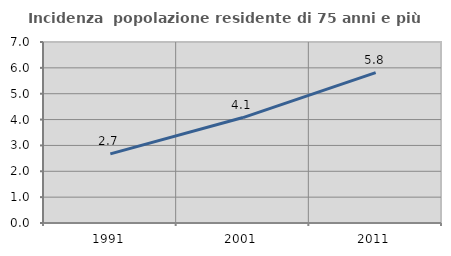
| Category | Incidenza  popolazione residente di 75 anni e più |
|---|---|
| 1991.0 | 2.672 |
| 2001.0 | 4.078 |
| 2011.0 | 5.814 |